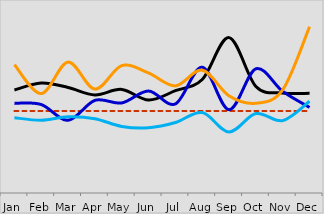
| Category | Org1 | Target / Benchmark / Std. | Org2 | Org3 | Org4 |
|---|---|---|---|---|---|
| Jan | 0.032 | 0.026 | 0.028 | 0.023 | 0.04 |
| Feb | 0.034 | 0.026 | 0.028 | 0.023 | 0.031 |
| Mar | 0.033 | 0.026 | 0.023 | 0.024 | 0.041 |
| Apr | 0.03 | 0.026 | 0.029 | 0.023 | 0.032 |
| May | 0.032 | 0.026 | 0.028 | 0.021 | 0.04 |
| Jun | 0.029 | 0.026 | 0.032 | 0.02 | 0.037 |
| Jul | 0.032 | 0.026 | 0.028 | 0.022 | 0.033 |
| Aug | 0.035 | 0.026 | 0.039 | 0.025 | 0.038 |
| Sep | 0.048 | 0.026 | 0.026 | 0.019 | 0.03 |
| Oct | 0.033 | 0.026 | 0.039 | 0.025 | 0.028 |
| Nov | 0.031 | 0.026 | 0.032 | 0.022 | 0.032 |
| Dec | 0.031 | 0.026 | 0.027 | 0.028 | 0.052 |